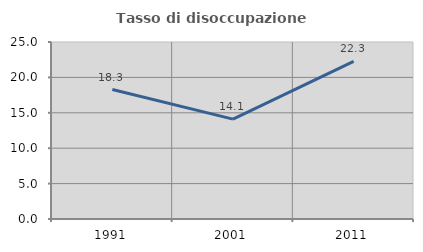
| Category | Tasso di disoccupazione giovanile  |
|---|---|
| 1991.0 | 18.29 |
| 2001.0 | 14.108 |
| 2011.0 | 22.273 |